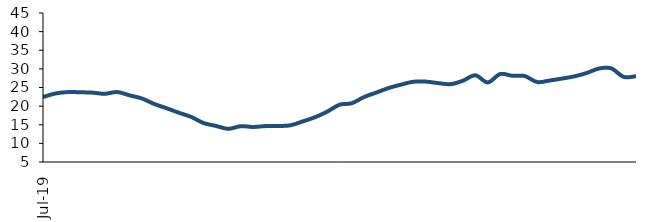
| Category | Series 0 |
|---|---|
| 2019-07-01 | 22.436 |
| 2019-08-01 | 23.387 |
| 2019-09-01 | 23.768 |
| 2019-10-01 | 23.718 |
| 2019-11-01 | 23.62 |
| 2019-12-01 | 23.31 |
| 2020-01-01 | 23.785 |
| 2020-02-01 | 22.896 |
| 2020-03-01 | 22.054 |
| 2020-04-01 | 20.588 |
| 2020-05-01 | 19.441 |
| 2020-06-01 | 18.223 |
| 2020-07-01 | 17.09 |
| 2020-08-01 | 15.464 |
| 2020-09-01 | 14.683 |
| 2020-10-01 | 13.904 |
| 2020-11-01 | 14.612 |
| 2020-12-01 | 14.405 |
| 2021-01-01 | 14.638 |
| 2021-02-01 | 14.659 |
| 2021-03-01 | 14.838 |
| 2021-04-01 | 15.862 |
| 2021-05-01 | 16.999 |
| 2021-06-01 | 18.499 |
| 2021-07-01 | 20.368 |
| 2021-08-01 | 20.783 |
| 2021-09-01 | 22.46 |
| 2021-10-01 | 23.66 |
| 2021-11-01 | 24.883 |
| 2021-12-01 | 25.79 |
| 2022-01-01 | 26.554 |
| 2022-02-01 | 26.576 |
| 2022-03-01 | 26.178 |
| 2022-04-01 | 25.897 |
| 2022-05-01 | 26.829 |
| 2022-06-01 | 28.281 |
| 2022-07-01 | 26.359 |
| 2022-08-01 | 28.604 |
| 2022-09-01 | 28.14 |
| 2022-10-01 | 28.066 |
| 2022-11-01 | 26.461 |
| 2022-12-01 | 26.868 |
| 2023-01-01 | 27.389 |
| 2023-02-01 | 27.987 |
| 2023-03-01 | 28.877 |
| 2023-04-01 | 30.096 |
| 2023-05-01 | 30.136 |
| 2023-06-01 | 27.855 |
| 2023-07-01 | 28.026 |